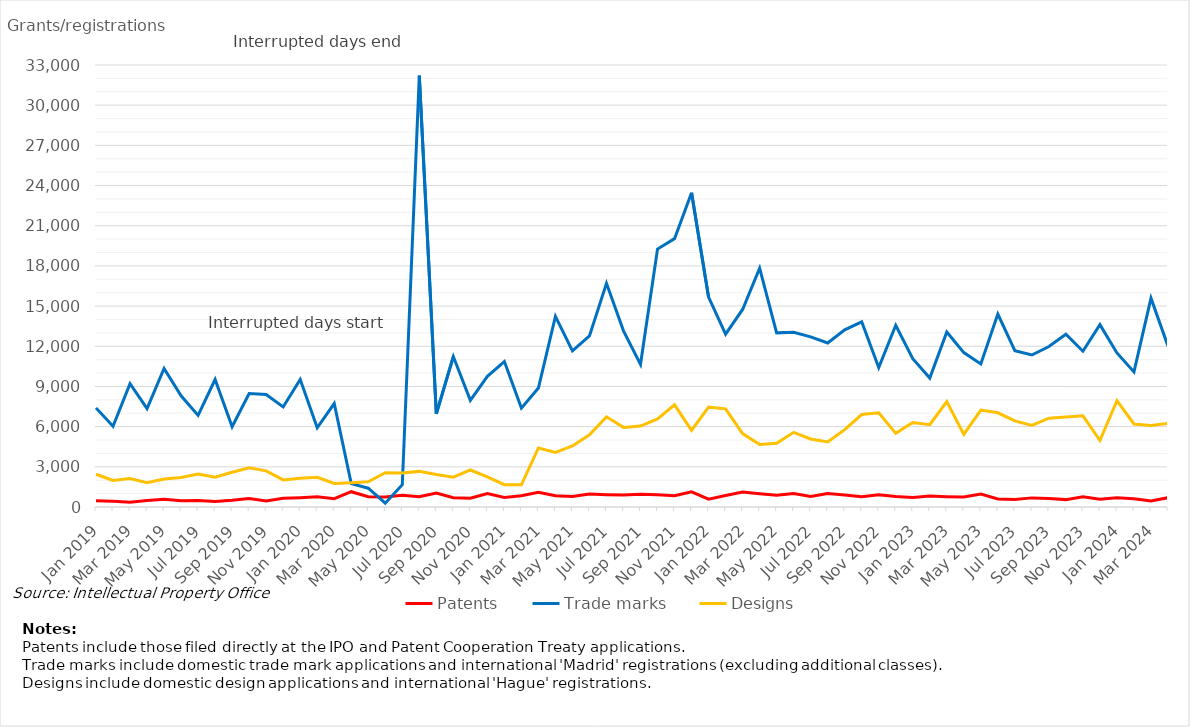
| Category | Patents | Trade marks | Designs |
|---|---|---|---|
| Jan 2019 | 474 | 7396 | 2444 |
| Feb 2019 | 426 | 6023 | 1987 |
| Mar 2019 | 363 | 9208 | 2125 |
| Apr 2019 | 488 | 7342 | 1810 |
| May 2019 | 573 | 10347 | 2096 |
| Jun 2019 | 471 | 8307 | 2202 |
| Jul 2019 | 489 | 6842 | 2464 |
| Aug 2019 | 420 | 9519 | 2218 |
| Sep 2019 | 500 | 5994 | 2596 |
| Oct 2019 | 634 | 8466 | 2926 |
| Nov 2019 | 455 | 8405 | 2700 |
| Dec 2019 | 654 | 7470 | 2021 |
| Jan 2020 | 696 | 9529 | 2145 |
| Feb 2020 | 756 | 5911 | 2219 |
| Mar 2020 | 622 | 7723 | 1757 |
| Apr 2020 | 1143 | 1744 | 1803 |
| May 2020 | 768 | 1402 | 1888 |
| Jun 2020 | 740 | 282 | 2564 |
| Jul 2020 | 878 | 1664 | 2539 |
| Aug 2020 | 771 | 32206 | 2659 |
| Sep 2020 | 1042 | 6950 | 2425 |
| Oct 2020 | 697 | 11231 | 2223 |
| Nov 2020 | 649 | 7958 | 2763 |
| Dec 2020 | 1010 | 9754 | 2252 |
| Jan 2021 | 708 | 10859 | 1665 |
| Feb 2021 | 838 | 7384 | 1660 |
| Mar 2021 | 1107 | 8881 | 4408 |
| Apr 2021 | 838 | 14238 | 4074 |
| May 2021 | 788 | 11657 | 4562 |
| Jun 2021 | 972 | 12777 | 5385 |
| Jul 2021 | 918 | 16702 | 6731 |
| Aug 2021 | 887 | 13154 | 5944 |
| Sep 2021 | 947 | 10651 | 6041 |
| Oct 2021 | 920 | 19257 | 6577 |
| Nov 2021 | 841 | 20035 | 7629 |
| Dec 2021 | 1131 | 23457 | 5719 |
| Jan 2022 | 585 | 15667 | 7455 |
| Feb 2022 | 860 | 12903 | 7329 |
| Mar 2022 | 1111 | 14749 | 5482 |
| Apr 2022 | 990 | 17826 | 4662 |
| May 2022 | 883 | 13001 | 4763 |
| Jun 2022 | 1010 | 13039 | 5577 |
| Jul 2022 | 788 | 12706 | 5082 |
| Aug 2022 | 1007 | 12245 | 4856 |
| Sep 2022 | 889 | 13232 | 5776 |
| Oct 2022 | 758 | 13825 | 6904 |
| Nov 2022 | 920 | 10408 | 7027 |
| Dec 2022 | 777 | 13568 | 5498 |
| Jan 2023 | 708 | 11069 | 6304 |
| Feb 2023 | 817 | 9627 | 6141 |
| Mar 2023 | 770 | 13066 | 7872 |
| Apr 2023 | 747 | 11526 | 5420 |
| May 2023 | 963 | 10681 | 7237 |
| Jun 2023 | 606 | 14400 | 7032 |
| Jul 2023 | 561 | 11673 | 6425 |
| Aug 2023 | 681 | 11349 | 6095 |
| Sep 2023 | 638 | 11981 | 6631 |
| Oct 2023 | 551 | 12895 | 6727 |
| Nov 2023 | 762 | 11629 | 6810 |
| Dec 2023 | 573 | 13616 | 4964 |
| Jan 2024 | 694 | 11504 | 7940 |
| Feb 2024 | 609 | 10084 | 6201 |
| Mar 2024 | 456 | 15594 | 6083 |
| April 2024 | 696 | 12007 | 6244 |